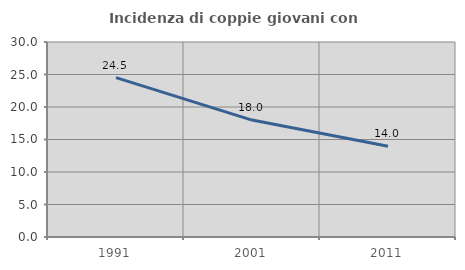
| Category | Incidenza di coppie giovani con figli |
|---|---|
| 1991.0 | 24.529 |
| 2001.0 | 17.988 |
| 2011.0 | 13.974 |